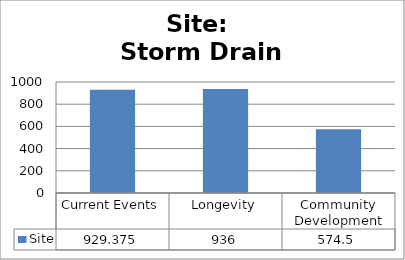
| Category | Site |
|---|---|
| Current Events | 929.375 |
| Longevity | 936 |
| Community Development | 574.5 |